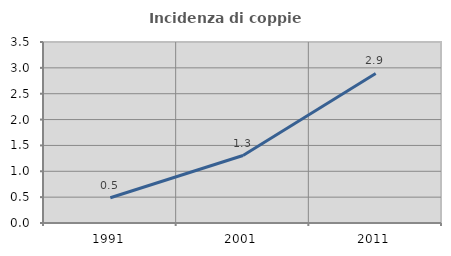
| Category | Incidenza di coppie miste |
|---|---|
| 1991.0 | 0.488 |
| 2001.0 | 1.304 |
| 2011.0 | 2.893 |